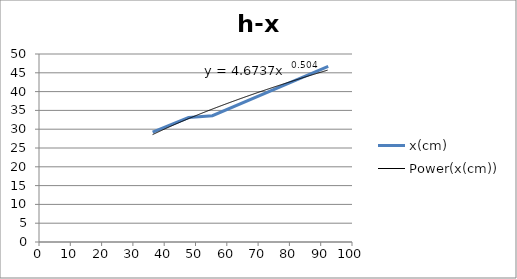
| Category | x(cm) |
|---|---|
| 92.4 | 46.7 |
| 55.4 | 33.6 |
| 47.8 | 33.1 |
| 36.3 | 29.2 |